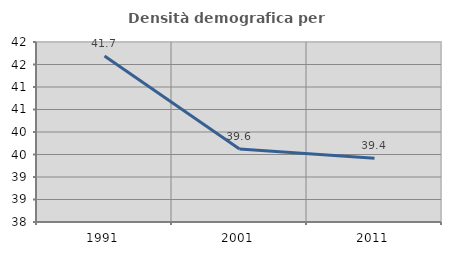
| Category | Densità demografica |
|---|---|
| 1991.0 | 41.688 |
| 2001.0 | 39.624 |
| 2011.0 | 39.418 |